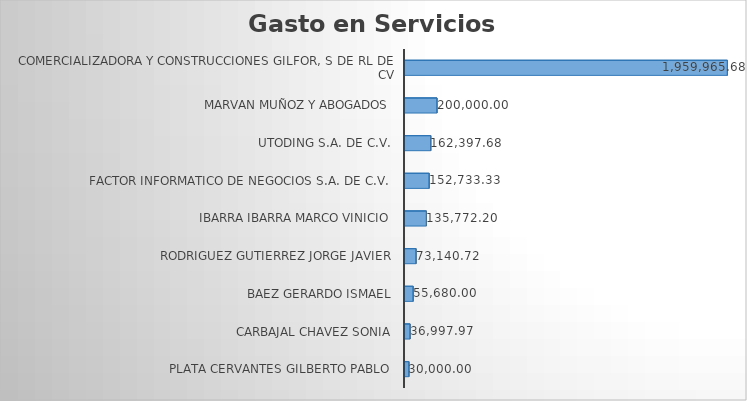
| Category | Suma |
|---|---|
| PLATA CERVANTES GILBERTO PABLO | 30000 |
| CARBAJAL CHAVEZ SONIA | 36997.97 |
| BAEZ GERARDO ISMAEL | 55680 |
| RODRIGUEZ GUTIERREZ JORGE JAVIER | 73140.72 |
| IBARRA IBARRA MARCO VINICIO | 135772.2 |
| FACTOR INFORMATICO DE NEGOCIOS S.A. DE C.V. | 152733.33 |
| UTODING S.A. DE C.V. | 162397.68 |
| MARVAN MUÑOZ Y ABOGADOS | 200000 |
| COMERCIALIZADORA Y CONSTRUCCIONES GILFOR, S DE RL DE CV | 1959965.68 |